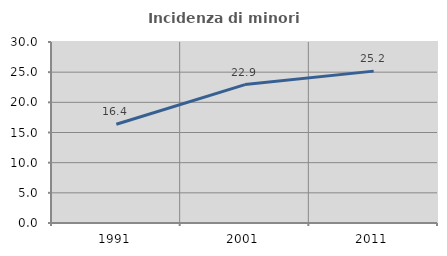
| Category | Incidenza di minori stranieri |
|---|---|
| 1991.0 | 16.364 |
| 2001.0 | 22.944 |
| 2011.0 | 25.172 |